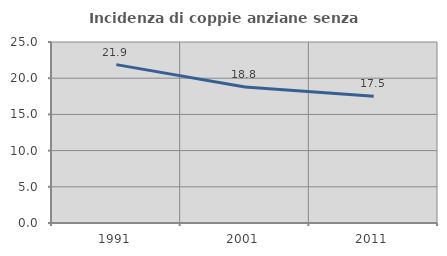
| Category | Incidenza di coppie anziane senza figli  |
|---|---|
| 1991.0 | 21.875 |
| 2001.0 | 18.792 |
| 2011.0 | 17.518 |